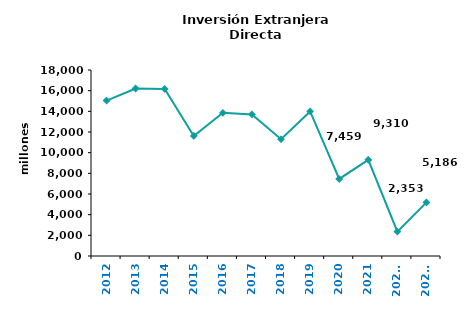
| Category | Series 0 |
|---|---|
| 2012 | 15039.979 |
| 2013 | 16210.419 |
| 2014 | 16168.702 |
| 2015 | 11620.533 |
| 2016 | 13857.938 |
| 2017 | 13700.88 |
| 2018 | 11298.693 |
| 2019 | 13989.154 |
| 2020 | 7458.625 |
| 2021 | 9309.781 |
| 2021* | 2353.374 |
| 2022* | 5186.336 |